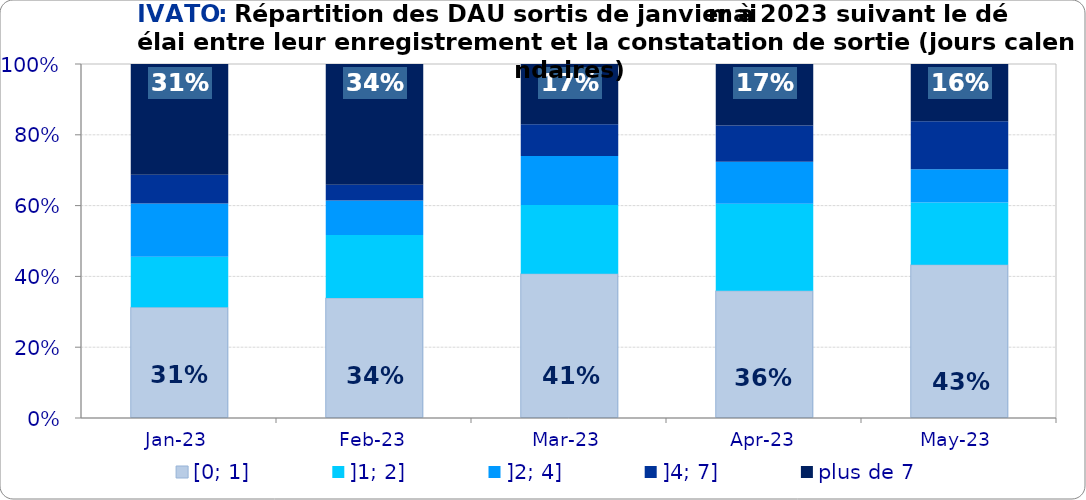
| Category | [0; 1] | ]1; 2] | ]2; 4] | ]4; 7] | plus de 7 |
|---|---|---|---|---|---|
| 2023-01-01 | 0.313 | 0.142 | 0.151 | 0.081 | 0.313 |
| 2023-02-01 | 0.339 | 0.178 | 0.097 | 0.045 | 0.341 |
| 2023-03-01 | 0.408 | 0.194 | 0.139 | 0.09 | 0.17 |
| 2023-04-01 | 0.359 | 0.246 | 0.119 | 0.103 | 0.173 |
| 2023-05-01 | 0.433 | 0.176 | 0.094 | 0.136 | 0.162 |